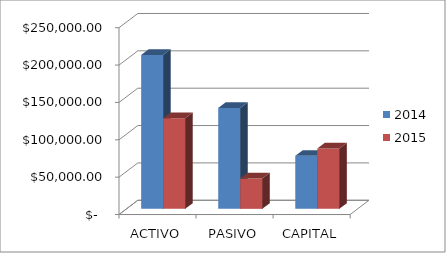
| Category | 2014 | 2015 |
|---|---|---|
| ACTIVO | 205889 | 121371.69 |
| PASIVO | 134940 | 40574.5 |
| CAPITAL | 70959 | 80797.19 |